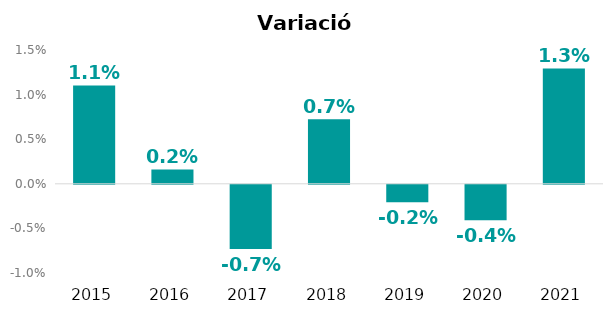
| Category | Variació interanual |
|---|---|
| 2015.0 | 0.011 |
| 2016.0 | 0.002 |
| 2017.0 | -0.007 |
| 2018.0 | 0.007 |
| 2019.0 | -0.002 |
| 2020.0 | -0.004 |
| 2021.0 | 0.013 |